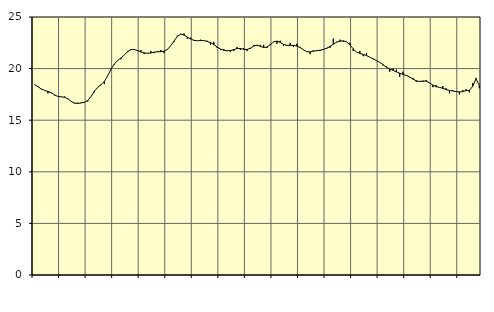
| Category | Piggar | Series 1 |
|---|---|---|
| nan | 18.5 | 18.46 |
| 87.0 | 18.3 | 18.24 |
| 87.0 | 18 | 18.03 |
| 87.0 | 17.9 | 17.89 |
| nan | 17.6 | 17.79 |
| 88.0 | 17.7 | 17.65 |
| 88.0 | 17.4 | 17.45 |
| 88.0 | 17.3 | 17.3 |
| nan | 17.3 | 17.26 |
| 89.0 | 17.3 | 17.22 |
| 89.0 | 17.1 | 17.07 |
| 89.0 | 16.8 | 16.83 |
| nan | 16.6 | 16.66 |
| 90.0 | 16.7 | 16.63 |
| 90.0 | 16.7 | 16.67 |
| 90.0 | 16.7 | 16.73 |
| nan | 16.8 | 16.91 |
| 91.0 | 17.3 | 17.31 |
| 91.0 | 17.7 | 17.81 |
| 91.0 | 18.2 | 18.19 |
| nan | 18.4 | 18.43 |
| 92.0 | 18.5 | 18.76 |
| 92.0 | 19.3 | 19.3 |
| 92.0 | 20 | 19.94 |
| nan | 20.4 | 20.45 |
| 93.0 | 20.8 | 20.78 |
| 93.0 | 20.9 | 21.03 |
| 93.0 | 21.3 | 21.31 |
| nan | 21.7 | 21.63 |
| 94.0 | 21.9 | 21.84 |
| 94.0 | 21.9 | 21.85 |
| 94.0 | 21.7 | 21.75 |
| nan | 21.8 | 21.62 |
| 95.0 | 21.4 | 21.52 |
| 95.0 | 21.5 | 21.49 |
| 95.0 | 21.7 | 21.51 |
| nan | 21.5 | 21.59 |
| 96.0 | 21.7 | 21.63 |
| 96.0 | 21.8 | 21.64 |
| 96.0 | 21.5 | 21.69 |
| nan | 21.9 | 21.86 |
| 97.0 | 22.2 | 22.21 |
| 97.0 | 22.6 | 22.67 |
| 97.0 | 23.2 | 23.12 |
| nan | 23.3 | 23.34 |
| 98.0 | 23.4 | 23.25 |
| 98.0 | 22.9 | 23.05 |
| 98.0 | 23 | 22.87 |
| nan | 22.7 | 22.74 |
| 99.0 | 22.7 | 22.7 |
| 99.0 | 22.8 | 22.72 |
| 99.0 | 22.7 | 22.71 |
| nan | 22.7 | 22.63 |
| 0.0 | 22.3 | 22.52 |
| 0.0 | 22.6 | 22.33 |
| 0.0 | 22 | 22.09 |
| nan | 21.8 | 21.89 |
| 1.0 | 21.9 | 21.78 |
| 1.0 | 21.7 | 21.73 |
| 1.0 | 21.6 | 21.74 |
| nan | 21.7 | 21.84 |
| 2.0 | 22.1 | 21.94 |
| 2.0 | 21.8 | 21.95 |
| 2.0 | 22 | 21.87 |
| nan | 21.7 | 21.85 |
| 3.0 | 21.9 | 21.98 |
| 3.0 | 22.3 | 22.18 |
| 3.0 | 22.2 | 22.27 |
| nan | 22.3 | 22.16 |
| 4.0 | 22.3 | 22.04 |
| 4.0 | 22 | 22.09 |
| 4.0 | 22.4 | 22.31 |
| nan | 22.6 | 22.58 |
| 5.0 | 22.4 | 22.67 |
| 5.0 | 22.7 | 22.54 |
| 5.0 | 22.2 | 22.35 |
| nan | 22.2 | 22.25 |
| 6.0 | 22.5 | 22.25 |
| 6.0 | 22.1 | 22.25 |
| 6.0 | 22.4 | 22.18 |
| nan | 22.1 | 22.04 |
| 7.0 | 21.8 | 21.82 |
| 7.0 | 21.7 | 21.64 |
| 7.0 | 21.4 | 21.62 |
| nan | 21.8 | 21.69 |
| 8.0 | 21.8 | 21.74 |
| 8.0 | 21.7 | 21.78 |
| 8.0 | 21.9 | 21.85 |
| nan | 21.9 | 21.98 |
| 9.0 | 22 | 22.15 |
| 9.0 | 22.9 | 22.37 |
| 9.0 | 22.6 | 22.56 |
| nan | 22.8 | 22.66 |
| 10.0 | 22.6 | 22.69 |
| 10.0 | 22.6 | 22.6 |
| 10.0 | 22.5 | 22.3 |
| nan | 21.7 | 21.91 |
| 11.0 | 21.6 | 21.61 |
| 11.0 | 21.7 | 21.47 |
| 11.0 | 21.2 | 21.38 |
| nan | 21.5 | 21.26 |
| 12.0 | 21.1 | 21.11 |
| 12.0 | 20.9 | 20.95 |
| 12.0 | 20.8 | 20.77 |
| nan | 20.6 | 20.6 |
| 13.0 | 20.3 | 20.38 |
| 13.0 | 20.2 | 20.13 |
| 13.0 | 19.7 | 19.96 |
| nan | 20 | 19.83 |
| 14.0 | 19.9 | 19.69 |
| 14.0 | 19.2 | 19.55 |
| 14.0 | 19.7 | 19.43 |
| nan | 19.3 | 19.34 |
| 15.0 | 19.2 | 19.18 |
| 15.0 | 19.1 | 18.98 |
| 15.0 | 18.7 | 18.82 |
| nan | 18.8 | 18.75 |
| 16.0 | 18.7 | 18.8 |
| 16.0 | 18.9 | 18.78 |
| 16.0 | 18.6 | 18.62 |
| nan | 18.2 | 18.4 |
| 17.0 | 18.4 | 18.25 |
| 17.0 | 18.2 | 18.18 |
| 17.0 | 18.3 | 18.09 |
| nan | 18.1 | 17.96 |
| 18.0 | 17.6 | 17.88 |
| 18.0 | 17.9 | 17.83 |
| 18.0 | 17.8 | 17.77 |
| nan | 17.5 | 17.74 |
| 19.0 | 17.9 | 17.77 |
| 19.0 | 18 | 17.87 |
| 19.0 | 17.7 | 17.88 |
| nan | 18.6 | 18.29 |
| 20.0 | 19.1 | 19.01 |
| 20.0 | 18.1 | 18.36 |